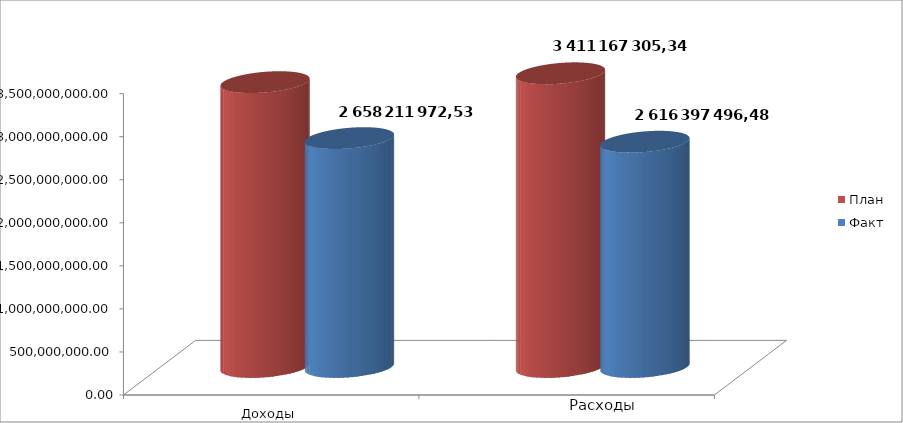
| Category | План | Факт |
|---|---|---|
| 0 | 3308234286.46 | 2658211972.53 |
| 1 | 3411167305.34 | 2616397496.48 |